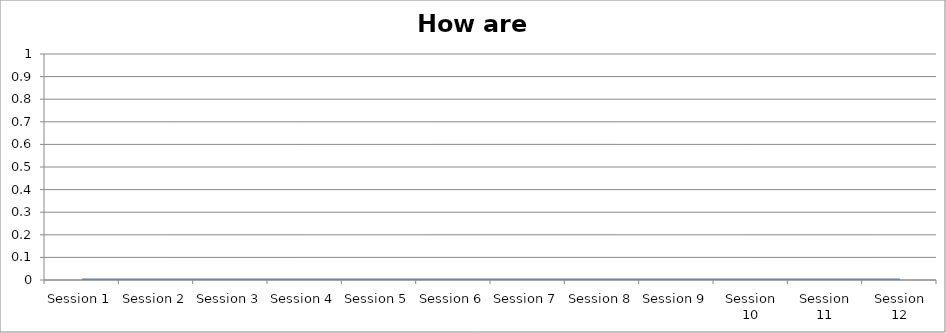
| Category | Total |
|---|---|
| Session 1 | 0 |
| Session 2 | 0 |
| Session 3 | 0 |
| Session 4 | 0 |
| Session 5 | 0 |
| Session 6 | 0 |
| Session 7 | 0 |
| Session 8 | 0 |
| Session 9 | 0 |
| Session 10 | 0 |
| Session 11 | 0 |
| Session 12 | 0 |